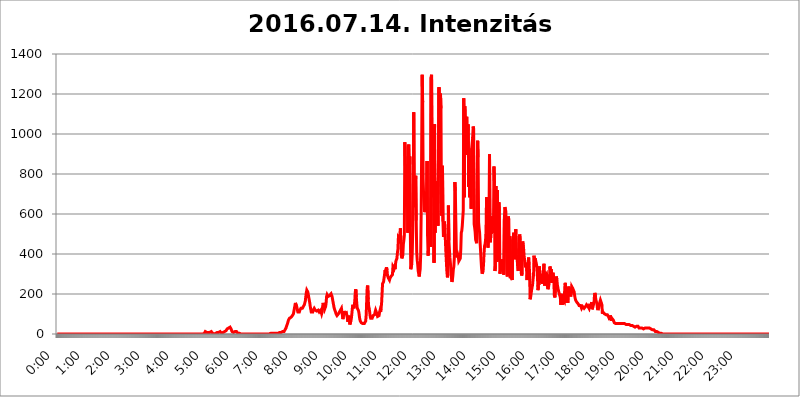
| Category | 2016.07.14. Intenzitás [W/m^2] |
|---|---|
| 0.0 | 0 |
| 0.0006944444444444445 | 0 |
| 0.001388888888888889 | 0 |
| 0.0020833333333333333 | 0 |
| 0.002777777777777778 | 0 |
| 0.003472222222222222 | 0 |
| 0.004166666666666667 | 0 |
| 0.004861111111111111 | 0 |
| 0.005555555555555556 | 0 |
| 0.0062499999999999995 | 0 |
| 0.006944444444444444 | 0 |
| 0.007638888888888889 | 0 |
| 0.008333333333333333 | 0 |
| 0.009027777777777779 | 0 |
| 0.009722222222222222 | 0 |
| 0.010416666666666666 | 0 |
| 0.011111111111111112 | 0 |
| 0.011805555555555555 | 0 |
| 0.012499999999999999 | 0 |
| 0.013194444444444444 | 0 |
| 0.013888888888888888 | 0 |
| 0.014583333333333332 | 0 |
| 0.015277777777777777 | 0 |
| 0.015972222222222224 | 0 |
| 0.016666666666666666 | 0 |
| 0.017361111111111112 | 0 |
| 0.018055555555555557 | 0 |
| 0.01875 | 0 |
| 0.019444444444444445 | 0 |
| 0.02013888888888889 | 0 |
| 0.020833333333333332 | 0 |
| 0.02152777777777778 | 0 |
| 0.022222222222222223 | 0 |
| 0.02291666666666667 | 0 |
| 0.02361111111111111 | 0 |
| 0.024305555555555556 | 0 |
| 0.024999999999999998 | 0 |
| 0.025694444444444447 | 0 |
| 0.02638888888888889 | 0 |
| 0.027083333333333334 | 0 |
| 0.027777777777777776 | 0 |
| 0.02847222222222222 | 0 |
| 0.029166666666666664 | 0 |
| 0.029861111111111113 | 0 |
| 0.030555555555555555 | 0 |
| 0.03125 | 0 |
| 0.03194444444444445 | 0 |
| 0.03263888888888889 | 0 |
| 0.03333333333333333 | 0 |
| 0.034027777777777775 | 0 |
| 0.034722222222222224 | 0 |
| 0.035416666666666666 | 0 |
| 0.036111111111111115 | 0 |
| 0.03680555555555556 | 0 |
| 0.0375 | 0 |
| 0.03819444444444444 | 0 |
| 0.03888888888888889 | 0 |
| 0.03958333333333333 | 0 |
| 0.04027777777777778 | 0 |
| 0.04097222222222222 | 0 |
| 0.041666666666666664 | 0 |
| 0.042361111111111106 | 0 |
| 0.04305555555555556 | 0 |
| 0.043750000000000004 | 0 |
| 0.044444444444444446 | 0 |
| 0.04513888888888889 | 0 |
| 0.04583333333333334 | 0 |
| 0.04652777777777778 | 0 |
| 0.04722222222222222 | 0 |
| 0.04791666666666666 | 0 |
| 0.04861111111111111 | 0 |
| 0.049305555555555554 | 0 |
| 0.049999999999999996 | 0 |
| 0.05069444444444445 | 0 |
| 0.051388888888888894 | 0 |
| 0.052083333333333336 | 0 |
| 0.05277777777777778 | 0 |
| 0.05347222222222222 | 0 |
| 0.05416666666666667 | 0 |
| 0.05486111111111111 | 0 |
| 0.05555555555555555 | 0 |
| 0.05625 | 0 |
| 0.05694444444444444 | 0 |
| 0.057638888888888885 | 0 |
| 0.05833333333333333 | 0 |
| 0.05902777777777778 | 0 |
| 0.059722222222222225 | 0 |
| 0.06041666666666667 | 0 |
| 0.061111111111111116 | 0 |
| 0.06180555555555556 | 0 |
| 0.0625 | 0 |
| 0.06319444444444444 | 0 |
| 0.06388888888888888 | 0 |
| 0.06458333333333334 | 0 |
| 0.06527777777777778 | 0 |
| 0.06597222222222222 | 0 |
| 0.06666666666666667 | 0 |
| 0.06736111111111111 | 0 |
| 0.06805555555555555 | 0 |
| 0.06874999999999999 | 0 |
| 0.06944444444444443 | 0 |
| 0.07013888888888889 | 0 |
| 0.07083333333333333 | 0 |
| 0.07152777777777779 | 0 |
| 0.07222222222222223 | 0 |
| 0.07291666666666667 | 0 |
| 0.07361111111111111 | 0 |
| 0.07430555555555556 | 0 |
| 0.075 | 0 |
| 0.07569444444444444 | 0 |
| 0.0763888888888889 | 0 |
| 0.07708333333333334 | 0 |
| 0.07777777777777778 | 0 |
| 0.07847222222222222 | 0 |
| 0.07916666666666666 | 0 |
| 0.0798611111111111 | 0 |
| 0.08055555555555556 | 0 |
| 0.08125 | 0 |
| 0.08194444444444444 | 0 |
| 0.08263888888888889 | 0 |
| 0.08333333333333333 | 0 |
| 0.08402777777777777 | 0 |
| 0.08472222222222221 | 0 |
| 0.08541666666666665 | 0 |
| 0.08611111111111112 | 0 |
| 0.08680555555555557 | 0 |
| 0.08750000000000001 | 0 |
| 0.08819444444444445 | 0 |
| 0.08888888888888889 | 0 |
| 0.08958333333333333 | 0 |
| 0.09027777777777778 | 0 |
| 0.09097222222222222 | 0 |
| 0.09166666666666667 | 0 |
| 0.09236111111111112 | 0 |
| 0.09305555555555556 | 0 |
| 0.09375 | 0 |
| 0.09444444444444444 | 0 |
| 0.09513888888888888 | 0 |
| 0.09583333333333333 | 0 |
| 0.09652777777777777 | 0 |
| 0.09722222222222222 | 0 |
| 0.09791666666666667 | 0 |
| 0.09861111111111111 | 0 |
| 0.09930555555555555 | 0 |
| 0.09999999999999999 | 0 |
| 0.10069444444444443 | 0 |
| 0.1013888888888889 | 0 |
| 0.10208333333333335 | 0 |
| 0.10277777777777779 | 0 |
| 0.10347222222222223 | 0 |
| 0.10416666666666667 | 0 |
| 0.10486111111111111 | 0 |
| 0.10555555555555556 | 0 |
| 0.10625 | 0 |
| 0.10694444444444444 | 0 |
| 0.1076388888888889 | 0 |
| 0.10833333333333334 | 0 |
| 0.10902777777777778 | 0 |
| 0.10972222222222222 | 0 |
| 0.1111111111111111 | 0 |
| 0.11180555555555556 | 0 |
| 0.11180555555555556 | 0 |
| 0.1125 | 0 |
| 0.11319444444444444 | 0 |
| 0.11388888888888889 | 0 |
| 0.11458333333333333 | 0 |
| 0.11527777777777777 | 0 |
| 0.11597222222222221 | 0 |
| 0.11666666666666665 | 0 |
| 0.1173611111111111 | 0 |
| 0.11805555555555557 | 0 |
| 0.11944444444444445 | 0 |
| 0.12013888888888889 | 0 |
| 0.12083333333333333 | 0 |
| 0.12152777777777778 | 0 |
| 0.12222222222222223 | 0 |
| 0.12291666666666667 | 0 |
| 0.12291666666666667 | 0 |
| 0.12361111111111112 | 0 |
| 0.12430555555555556 | 0 |
| 0.125 | 0 |
| 0.12569444444444444 | 0 |
| 0.12638888888888888 | 0 |
| 0.12708333333333333 | 0 |
| 0.16875 | 0 |
| 0.12847222222222224 | 0 |
| 0.12916666666666668 | 0 |
| 0.12986111111111112 | 0 |
| 0.13055555555555556 | 0 |
| 0.13125 | 0 |
| 0.13194444444444445 | 0 |
| 0.1326388888888889 | 0 |
| 0.13333333333333333 | 0 |
| 0.13402777777777777 | 0 |
| 0.13402777777777777 | 0 |
| 0.13472222222222222 | 0 |
| 0.13541666666666666 | 0 |
| 0.1361111111111111 | 0 |
| 0.13749999999999998 | 0 |
| 0.13819444444444443 | 0 |
| 0.1388888888888889 | 0 |
| 0.13958333333333334 | 0 |
| 0.14027777777777778 | 0 |
| 0.14097222222222222 | 0 |
| 0.14166666666666666 | 0 |
| 0.1423611111111111 | 0 |
| 0.14305555555555557 | 0 |
| 0.14375000000000002 | 0 |
| 0.14444444444444446 | 0 |
| 0.1451388888888889 | 0 |
| 0.1451388888888889 | 0 |
| 0.14652777777777778 | 0 |
| 0.14722222222222223 | 0 |
| 0.14791666666666667 | 0 |
| 0.1486111111111111 | 0 |
| 0.14930555555555555 | 0 |
| 0.15 | 0 |
| 0.15069444444444444 | 0 |
| 0.15138888888888888 | 0 |
| 0.15208333333333332 | 0 |
| 0.15277777777777776 | 0 |
| 0.15347222222222223 | 0 |
| 0.15416666666666667 | 0 |
| 0.15486111111111112 | 0 |
| 0.15555555555555556 | 0 |
| 0.15625 | 0 |
| 0.15694444444444444 | 0 |
| 0.15763888888888888 | 0 |
| 0.15833333333333333 | 0 |
| 0.15902777777777777 | 0 |
| 0.15972222222222224 | 0 |
| 0.16041666666666668 | 0 |
| 0.16111111111111112 | 0 |
| 0.16180555555555556 | 0 |
| 0.1625 | 0 |
| 0.16319444444444445 | 0 |
| 0.1638888888888889 | 0 |
| 0.16458333333333333 | 0 |
| 0.16527777777777777 | 0 |
| 0.16597222222222222 | 0 |
| 0.16666666666666666 | 0 |
| 0.1673611111111111 | 0 |
| 0.16805555555555554 | 0 |
| 0.16874999999999998 | 0 |
| 0.16944444444444443 | 0 |
| 0.17013888888888887 | 0 |
| 0.1708333333333333 | 0 |
| 0.17152777777777775 | 0 |
| 0.17222222222222225 | 0 |
| 0.1729166666666667 | 0 |
| 0.17361111111111113 | 0 |
| 0.17430555555555557 | 0 |
| 0.17500000000000002 | 0 |
| 0.17569444444444446 | 0 |
| 0.1763888888888889 | 0 |
| 0.17708333333333334 | 0 |
| 0.17777777777777778 | 0 |
| 0.17847222222222223 | 0 |
| 0.17916666666666667 | 0 |
| 0.1798611111111111 | 0 |
| 0.18055555555555555 | 0 |
| 0.18125 | 0 |
| 0.18194444444444444 | 0 |
| 0.1826388888888889 | 0 |
| 0.18333333333333335 | 0 |
| 0.1840277777777778 | 0 |
| 0.18472222222222223 | 0 |
| 0.18541666666666667 | 0 |
| 0.18611111111111112 | 0 |
| 0.18680555555555556 | 0 |
| 0.1875 | 0 |
| 0.18819444444444444 | 0 |
| 0.18888888888888888 | 0 |
| 0.18958333333333333 | 0 |
| 0.19027777777777777 | 0 |
| 0.1909722222222222 | 0 |
| 0.19166666666666665 | 0 |
| 0.19236111111111112 | 0 |
| 0.19305555555555554 | 0 |
| 0.19375 | 0 |
| 0.19444444444444445 | 0 |
| 0.1951388888888889 | 0 |
| 0.19583333333333333 | 0 |
| 0.19652777777777777 | 0 |
| 0.19722222222222222 | 0 |
| 0.19791666666666666 | 0 |
| 0.1986111111111111 | 0 |
| 0.19930555555555554 | 0 |
| 0.19999999999999998 | 0 |
| 0.20069444444444443 | 0 |
| 0.20138888888888887 | 0 |
| 0.2020833333333333 | 0 |
| 0.2027777777777778 | 0 |
| 0.2034722222222222 | 0 |
| 0.2041666666666667 | 0 |
| 0.20486111111111113 | 0 |
| 0.20555555555555557 | 3.525 |
| 0.20625000000000002 | 3.525 |
| 0.20694444444444446 | 7.887 |
| 0.2076388888888889 | 12.257 |
| 0.20833333333333334 | 7.887 |
| 0.20902777777777778 | 7.887 |
| 0.20972222222222223 | 7.887 |
| 0.21041666666666667 | 7.887 |
| 0.2111111111111111 | 7.887 |
| 0.21180555555555555 | 7.887 |
| 0.2125 | 7.887 |
| 0.21319444444444444 | 7.887 |
| 0.2138888888888889 | 7.887 |
| 0.21458333333333335 | 12.257 |
| 0.2152777777777778 | 12.257 |
| 0.21597222222222223 | 12.257 |
| 0.21666666666666667 | 7.887 |
| 0.21736111111111112 | 7.887 |
| 0.21805555555555556 | 3.525 |
| 0.21875 | 0 |
| 0.21944444444444444 | 0 |
| 0.22013888888888888 | 0 |
| 0.22083333333333333 | 0 |
| 0.22152777777777777 | 0 |
| 0.2222222222222222 | 3.525 |
| 0.22291666666666665 | 3.525 |
| 0.2236111111111111 | 7.887 |
| 0.22430555555555556 | 7.887 |
| 0.225 | 7.887 |
| 0.22569444444444445 | 7.887 |
| 0.2263888888888889 | 7.887 |
| 0.22708333333333333 | 12.257 |
| 0.22777777777777777 | 12.257 |
| 0.22847222222222222 | 12.257 |
| 0.22916666666666666 | 12.257 |
| 0.2298611111111111 | 7.887 |
| 0.23055555555555554 | 3.525 |
| 0.23124999999999998 | 3.525 |
| 0.23194444444444443 | 3.525 |
| 0.23263888888888887 | 7.887 |
| 0.2333333333333333 | 7.887 |
| 0.2340277777777778 | 12.257 |
| 0.2347222222222222 | 12.257 |
| 0.2354166666666667 | 12.257 |
| 0.23611111111111113 | 12.257 |
| 0.23680555555555557 | 16.636 |
| 0.23750000000000002 | 21.024 |
| 0.23819444444444446 | 25.419 |
| 0.2388888888888889 | 29.823 |
| 0.23958333333333334 | 29.823 |
| 0.24027777777777778 | 29.823 |
| 0.24097222222222223 | 29.823 |
| 0.24166666666666667 | 34.234 |
| 0.2423611111111111 | 34.234 |
| 0.24305555555555555 | 29.823 |
| 0.24375 | 25.419 |
| 0.24444444444444446 | 21.024 |
| 0.24513888888888888 | 12.257 |
| 0.24583333333333335 | 12.257 |
| 0.2465277777777778 | 7.887 |
| 0.24722222222222223 | 7.887 |
| 0.24791666666666667 | 7.887 |
| 0.24861111111111112 | 12.257 |
| 0.24930555555555556 | 12.257 |
| 0.25 | 12.257 |
| 0.25069444444444444 | 16.636 |
| 0.2513888888888889 | 12.257 |
| 0.2520833333333333 | 12.257 |
| 0.25277777777777777 | 7.887 |
| 0.2534722222222222 | 3.525 |
| 0.25416666666666665 | 3.525 |
| 0.2548611111111111 | 3.525 |
| 0.2555555555555556 | 3.525 |
| 0.25625000000000003 | 0 |
| 0.2569444444444445 | 0 |
| 0.2576388888888889 | 0 |
| 0.25833333333333336 | 0 |
| 0.2590277777777778 | 0 |
| 0.25972222222222224 | 0 |
| 0.2604166666666667 | 0 |
| 0.2611111111111111 | 0 |
| 0.26180555555555557 | 0 |
| 0.2625 | 0 |
| 0.26319444444444445 | 0 |
| 0.2638888888888889 | 0 |
| 0.26458333333333334 | 0 |
| 0.2652777777777778 | 0 |
| 0.2659722222222222 | 0 |
| 0.26666666666666666 | 0 |
| 0.2673611111111111 | 0 |
| 0.26805555555555555 | 0 |
| 0.26875 | 0 |
| 0.26944444444444443 | 0 |
| 0.2701388888888889 | 0 |
| 0.2708333333333333 | 0 |
| 0.27152777777777776 | 0 |
| 0.2722222222222222 | 0 |
| 0.27291666666666664 | 0 |
| 0.2736111111111111 | 0 |
| 0.2743055555555555 | 0 |
| 0.27499999999999997 | 0 |
| 0.27569444444444446 | 0 |
| 0.27638888888888885 | 0 |
| 0.27708333333333335 | 0 |
| 0.2777777777777778 | 0 |
| 0.27847222222222223 | 0 |
| 0.2791666666666667 | 0 |
| 0.2798611111111111 | 0 |
| 0.28055555555555556 | 0 |
| 0.28125 | 0 |
| 0.28194444444444444 | 0 |
| 0.2826388888888889 | 0 |
| 0.2833333333333333 | 0 |
| 0.28402777777777777 | 0 |
| 0.2847222222222222 | 0 |
| 0.28541666666666665 | 0 |
| 0.28611111111111115 | 0 |
| 0.28680555555555554 | 0 |
| 0.28750000000000003 | 0 |
| 0.2881944444444445 | 0 |
| 0.2888888888888889 | 0 |
| 0.28958333333333336 | 0 |
| 0.2902777777777778 | 0 |
| 0.29097222222222224 | 0 |
| 0.2916666666666667 | 0 |
| 0.2923611111111111 | 0 |
| 0.29305555555555557 | 0 |
| 0.29375 | 0 |
| 0.29444444444444445 | 0 |
| 0.2951388888888889 | 0 |
| 0.29583333333333334 | 0 |
| 0.2965277777777778 | 0 |
| 0.2972222222222222 | 0 |
| 0.29791666666666666 | 0 |
| 0.2986111111111111 | 0 |
| 0.29930555555555555 | 3.525 |
| 0.3 | 0 |
| 0.30069444444444443 | 0 |
| 0.3013888888888889 | 3.525 |
| 0.3020833333333333 | 3.525 |
| 0.30277777777777776 | 3.525 |
| 0.3034722222222222 | 3.525 |
| 0.30416666666666664 | 3.525 |
| 0.3048611111111111 | 3.525 |
| 0.3055555555555555 | 3.525 |
| 0.30624999999999997 | 3.525 |
| 0.3069444444444444 | 3.525 |
| 0.3076388888888889 | 3.525 |
| 0.30833333333333335 | 3.525 |
| 0.3090277777777778 | 3.525 |
| 0.30972222222222223 | 3.525 |
| 0.3104166666666667 | 3.525 |
| 0.3111111111111111 | 3.525 |
| 0.31180555555555556 | 7.887 |
| 0.3125 | 7.887 |
| 0.31319444444444444 | 7.887 |
| 0.3138888888888889 | 7.887 |
| 0.3145833333333333 | 7.887 |
| 0.31527777777777777 | 7.887 |
| 0.3159722222222222 | 12.257 |
| 0.31666666666666665 | 12.257 |
| 0.31736111111111115 | 12.257 |
| 0.31805555555555554 | 12.257 |
| 0.31875000000000003 | 16.636 |
| 0.3194444444444445 | 21.024 |
| 0.3201388888888889 | 25.419 |
| 0.32083333333333336 | 29.823 |
| 0.3215277777777778 | 38.653 |
| 0.32222222222222224 | 43.079 |
| 0.3229166666666667 | 51.951 |
| 0.3236111111111111 | 60.85 |
| 0.32430555555555557 | 69.775 |
| 0.325 | 74.246 |
| 0.32569444444444445 | 78.722 |
| 0.3263888888888889 | 78.722 |
| 0.32708333333333334 | 83.205 |
| 0.3277777777777778 | 83.205 |
| 0.3284722222222222 | 83.205 |
| 0.32916666666666666 | 87.692 |
| 0.3298611111111111 | 92.184 |
| 0.33055555555555555 | 96.682 |
| 0.33125 | 101.184 |
| 0.33194444444444443 | 114.716 |
| 0.3326388888888889 | 128.284 |
| 0.3333333333333333 | 141.884 |
| 0.3340277777777778 | 155.509 |
| 0.3347222222222222 | 160.056 |
| 0.3354166666666667 | 150.964 |
| 0.3361111111111111 | 132.814 |
| 0.3368055555555556 | 119.235 |
| 0.33749999999999997 | 110.201 |
| 0.33819444444444446 | 110.201 |
| 0.33888888888888885 | 110.201 |
| 0.33958333333333335 | 110.201 |
| 0.34027777777777773 | 119.235 |
| 0.34097222222222223 | 123.758 |
| 0.3416666666666666 | 128.284 |
| 0.3423611111111111 | 128.284 |
| 0.3430555555555555 | 128.284 |
| 0.34375 | 128.284 |
| 0.3444444444444445 | 132.814 |
| 0.3451388888888889 | 137.347 |
| 0.3458333333333334 | 141.884 |
| 0.34652777777777777 | 146.423 |
| 0.34722222222222227 | 150.964 |
| 0.34791666666666665 | 164.605 |
| 0.34861111111111115 | 187.378 |
| 0.34930555555555554 | 205.62 |
| 0.35000000000000003 | 219.309 |
| 0.3506944444444444 | 219.309 |
| 0.3513888888888889 | 210.182 |
| 0.3520833333333333 | 196.497 |
| 0.3527777777777778 | 182.82 |
| 0.3534722222222222 | 169.156 |
| 0.3541666666666667 | 155.509 |
| 0.3548611111111111 | 137.347 |
| 0.35555555555555557 | 123.758 |
| 0.35625 | 110.201 |
| 0.35694444444444445 | 105.69 |
| 0.3576388888888889 | 110.201 |
| 0.35833333333333334 | 110.201 |
| 0.3590277777777778 | 119.235 |
| 0.3597222222222222 | 123.758 |
| 0.36041666666666666 | 128.284 |
| 0.3611111111111111 | 123.758 |
| 0.36180555555555555 | 119.235 |
| 0.3625 | 114.716 |
| 0.36319444444444443 | 114.716 |
| 0.3638888888888889 | 114.716 |
| 0.3645833333333333 | 119.235 |
| 0.3652777777777778 | 119.235 |
| 0.3659722222222222 | 119.235 |
| 0.3666666666666667 | 119.235 |
| 0.3673611111111111 | 110.201 |
| 0.3680555555555556 | 110.201 |
| 0.36874999999999997 | 114.716 |
| 0.36944444444444446 | 119.235 |
| 0.37013888888888885 | 114.716 |
| 0.37083333333333335 | 101.184 |
| 0.37152777777777773 | 110.201 |
| 0.37222222222222223 | 137.347 |
| 0.3729166666666666 | 155.509 |
| 0.3736111111111111 | 155.509 |
| 0.3743055555555555 | 150.964 |
| 0.375 | 123.758 |
| 0.3756944444444445 | 128.284 |
| 0.3763888888888889 | 137.347 |
| 0.3770833333333334 | 155.509 |
| 0.37777777777777777 | 187.378 |
| 0.37847222222222227 | 196.497 |
| 0.37916666666666665 | 191.937 |
| 0.37986111111111115 | 187.378 |
| 0.38055555555555554 | 182.82 |
| 0.38125000000000003 | 187.378 |
| 0.3819444444444444 | 191.937 |
| 0.3826388888888889 | 196.497 |
| 0.3833333333333333 | 196.497 |
| 0.3840277777777778 | 201.058 |
| 0.3847222222222222 | 196.497 |
| 0.3854166666666667 | 187.378 |
| 0.3861111111111111 | 173.709 |
| 0.38680555555555557 | 160.056 |
| 0.3875 | 146.423 |
| 0.38819444444444445 | 132.814 |
| 0.3888888888888889 | 123.758 |
| 0.38958333333333334 | 119.235 |
| 0.3902777777777778 | 110.201 |
| 0.3909722222222222 | 101.184 |
| 0.39166666666666666 | 96.682 |
| 0.3923611111111111 | 92.184 |
| 0.39305555555555555 | 87.692 |
| 0.39375 | 92.184 |
| 0.39444444444444443 | 101.184 |
| 0.3951388888888889 | 105.69 |
| 0.3958333333333333 | 110.201 |
| 0.3965277777777778 | 114.716 |
| 0.3972222222222222 | 119.235 |
| 0.3979166666666667 | 123.758 |
| 0.3986111111111111 | 128.284 |
| 0.3993055555555556 | 123.758 |
| 0.39999999999999997 | 92.184 |
| 0.40069444444444446 | 74.246 |
| 0.40138888888888885 | 96.682 |
| 0.40208333333333335 | 114.716 |
| 0.40277777777777773 | 114.716 |
| 0.40347222222222223 | 101.184 |
| 0.4041666666666666 | 96.682 |
| 0.4048611111111111 | 105.69 |
| 0.4055555555555555 | 105.69 |
| 0.40625 | 101.184 |
| 0.4069444444444445 | 78.722 |
| 0.4076388888888889 | 60.85 |
| 0.4083333333333334 | 78.722 |
| 0.40902777777777777 | 92.184 |
| 0.40972222222222227 | 65.31 |
| 0.41041666666666665 | 47.511 |
| 0.41111111111111115 | 51.951 |
| 0.41180555555555554 | 65.31 |
| 0.41250000000000003 | 78.722 |
| 0.4131944444444444 | 101.184 |
| 0.4138888888888889 | 128.284 |
| 0.4145833333333333 | 146.423 |
| 0.4152777777777778 | 141.884 |
| 0.4159722222222222 | 128.284 |
| 0.4166666666666667 | 141.884 |
| 0.4173611111111111 | 169.156 |
| 0.41805555555555557 | 210.182 |
| 0.41875 | 223.873 |
| 0.41944444444444445 | 182.82 |
| 0.4201388888888889 | 150.964 |
| 0.42083333333333334 | 128.284 |
| 0.4215277777777778 | 123.758 |
| 0.4222222222222222 | 119.235 |
| 0.42291666666666666 | 110.201 |
| 0.4236111111111111 | 92.184 |
| 0.42430555555555555 | 74.246 |
| 0.425 | 65.31 |
| 0.42569444444444443 | 60.85 |
| 0.4263888888888889 | 56.398 |
| 0.4270833333333333 | 56.398 |
| 0.4277777777777778 | 56.398 |
| 0.4284722222222222 | 51.951 |
| 0.4291666666666667 | 47.511 |
| 0.4298611111111111 | 47.511 |
| 0.4305555555555556 | 51.951 |
| 0.43124999999999997 | 56.398 |
| 0.43194444444444446 | 56.398 |
| 0.43263888888888885 | 65.31 |
| 0.43333333333333335 | 96.682 |
| 0.43402777777777773 | 169.156 |
| 0.43472222222222223 | 233 |
| 0.4354166666666666 | 242.127 |
| 0.4361111111111111 | 173.709 |
| 0.4368055555555555 | 137.347 |
| 0.4375 | 128.284 |
| 0.4381944444444445 | 110.201 |
| 0.4388888888888889 | 87.692 |
| 0.4395833333333334 | 78.722 |
| 0.44027777777777777 | 74.246 |
| 0.44097222222222227 | 74.246 |
| 0.44166666666666665 | 78.722 |
| 0.44236111111111115 | 83.205 |
| 0.44305555555555554 | 92.184 |
| 0.44375000000000003 | 92.184 |
| 0.4444444444444444 | 96.682 |
| 0.4451388888888889 | 96.682 |
| 0.4458333333333333 | 110.201 |
| 0.4465277777777778 | 119.235 |
| 0.4472222222222222 | 114.716 |
| 0.4479166666666667 | 105.69 |
| 0.4486111111111111 | 101.184 |
| 0.44930555555555557 | 87.692 |
| 0.45 | 87.692 |
| 0.45069444444444445 | 92.184 |
| 0.4513888888888889 | 92.184 |
| 0.45208333333333334 | 110.201 |
| 0.4527777777777778 | 119.235 |
| 0.4534722222222222 | 110.201 |
| 0.45416666666666666 | 128.284 |
| 0.4548611111111111 | 150.964 |
| 0.45555555555555555 | 201.058 |
| 0.45625 | 251.251 |
| 0.45694444444444443 | 246.689 |
| 0.4576388888888889 | 260.373 |
| 0.4583333333333333 | 278.603 |
| 0.4590277777777778 | 296.808 |
| 0.4597222222222222 | 319.517 |
| 0.4604166666666667 | 310.44 |
| 0.4611111111111111 | 314.98 |
| 0.4618055555555556 | 333.113 |
| 0.46249999999999997 | 319.517 |
| 0.46319444444444446 | 292.259 |
| 0.46388888888888885 | 287.709 |
| 0.46458333333333335 | 278.603 |
| 0.46527777777777773 | 274.047 |
| 0.46597222222222223 | 269.49 |
| 0.4666666666666666 | 278.603 |
| 0.4673611111111111 | 274.047 |
| 0.4680555555555555 | 287.709 |
| 0.46875 | 292.259 |
| 0.4694444444444445 | 283.156 |
| 0.4701388888888889 | 296.808 |
| 0.4708333333333334 | 337.639 |
| 0.47152777777777777 | 333.113 |
| 0.47222222222222227 | 328.584 |
| 0.47291666666666665 | 346.682 |
| 0.47361111111111115 | 324.052 |
| 0.47430555555555554 | 346.682 |
| 0.47500000000000003 | 364.728 |
| 0.4756944444444444 | 369.23 |
| 0.4763888888888889 | 378.224 |
| 0.4770833333333333 | 405.108 |
| 0.4777777777777778 | 422.943 |
| 0.4784722222222222 | 480.356 |
| 0.4791666666666667 | 484.735 |
| 0.4798611111111111 | 471.582 |
| 0.48055555555555557 | 467.187 |
| 0.48125 | 528.2 |
| 0.48194444444444445 | 458.38 |
| 0.4826388888888889 | 391.685 |
| 0.48333333333333334 | 378.224 |
| 0.4840277777777778 | 382.715 |
| 0.4847222222222222 | 396.164 |
| 0.48541666666666666 | 449.551 |
| 0.4861111111111111 | 467.187 |
| 0.48680555555555555 | 493.475 |
| 0.4875 | 958.814 |
| 0.48819444444444443 | 841.526 |
| 0.4888888888888889 | 638.256 |
| 0.4895833333333333 | 767.62 |
| 0.4902777777777778 | 849.199 |
| 0.4909722222222222 | 731.896 |
| 0.4916666666666667 | 506.542 |
| 0.4923611111111111 | 936.33 |
| 0.4930555555555556 | 947.58 |
| 0.49374999999999997 | 763.674 |
| 0.49444444444444446 | 887.309 |
| 0.49513888888888885 | 536.82 |
| 0.49583333333333335 | 324.052 |
| 0.49652777777777773 | 319.517 |
| 0.49722222222222223 | 351.198 |
| 0.4979166666666666 | 405.108 |
| 0.4986111111111111 | 519.555 |
| 0.4993055555555555 | 687.544 |
| 0.5 | 1108.816 |
| 0.5006944444444444 | 679.395 |
| 0.5013888888888889 | 634.105 |
| 0.5020833333333333 | 703.762 |
| 0.5027777777777778 | 791.169 |
| 0.5034722222222222 | 566.793 |
| 0.5041666666666667 | 409.574 |
| 0.5048611111111111 | 369.23 |
| 0.5055555555555555 | 346.682 |
| 0.50625 | 314.98 |
| 0.5069444444444444 | 301.354 |
| 0.5076388888888889 | 287.709 |
| 0.5083333333333333 | 305.898 |
| 0.5090277777777777 | 324.052 |
| 0.5097222222222222 | 396.164 |
| 0.5104166666666666 | 604.864 |
| 0.5111111111111112 | 928.819 |
| 0.5118055555555555 | 1296.248 |
| 0.5125000000000001 | 1158.689 |
| 0.5131944444444444 | 775.492 |
| 0.513888888888889 | 687.544 |
| 0.5145833333333333 | 691.608 |
| 0.5152777777777778 | 609.062 |
| 0.5159722222222222 | 625.784 |
| 0.5166666666666667 | 679.395 |
| 0.517361111111111 | 711.832 |
| 0.5180555555555556 | 663.019 |
| 0.5187499999999999 | 864.493 |
| 0.5194444444444445 | 489.108 |
| 0.5201388888888888 | 391.685 |
| 0.5208333333333334 | 436.27 |
| 0.5215277777777778 | 436.27 |
| 0.5222222222222223 | 471.582 |
| 0.5229166666666667 | 532.513 |
| 0.5236111111111111 | 436.27 |
| 0.5243055555555556 | 1283.541 |
| 0.525 | 1296.248 |
| 0.5256944444444445 | 802.868 |
| 0.5263888888888889 | 879.719 |
| 0.5270833333333333 | 683.473 |
| 0.5277777777777778 | 894.885 |
| 0.5284722222222222 | 355.712 |
| 0.5291666666666667 | 1048.508 |
| 0.5298611111111111 | 506.542 |
| 0.5305555555555556 | 763.674 |
| 0.53125 | 658.909 |
| 0.5319444444444444 | 545.416 |
| 0.5326388888888889 | 695.666 |
| 0.5333333333333333 | 638.256 |
| 0.5340277777777778 | 541.121 |
| 0.5347222222222222 | 545.416 |
| 0.5354166666666667 | 1233.951 |
| 0.5361111111111111 | 818.392 |
| 0.5368055555555555 | 1186.03 |
| 0.5375 | 1201.843 |
| 0.5381944444444444 | 1127.879 |
| 0.5388888888888889 | 592.233 |
| 0.5395833333333333 | 810.641 |
| 0.5402777777777777 | 841.526 |
| 0.5409722222222222 | 562.53 |
| 0.5416666666666666 | 484.735 |
| 0.5423611111111112 | 497.836 |
| 0.5430555555555555 | 562.53 |
| 0.5437500000000001 | 523.88 |
| 0.5444444444444444 | 462.786 |
| 0.545138888888889 | 405.108 |
| 0.5458333333333333 | 355.712 |
| 0.5465277777777778 | 310.44 |
| 0.5472222222222222 | 283.156 |
| 0.5479166666666667 | 301.354 |
| 0.548611111111111 | 642.4 |
| 0.5493055555555556 | 467.187 |
| 0.5499999999999999 | 422.943 |
| 0.5506944444444445 | 382.715 |
| 0.5513888888888888 | 355.712 |
| 0.5520833333333334 | 324.052 |
| 0.5527777777777778 | 283.156 |
| 0.5534722222222223 | 260.373 |
| 0.5541666666666667 | 269.49 |
| 0.5548611111111111 | 292.259 |
| 0.5555555555555556 | 324.052 |
| 0.55625 | 337.639 |
| 0.5569444444444445 | 382.715 |
| 0.5576388888888889 | 759.723 |
| 0.5583333333333333 | 715.858 |
| 0.5590277777777778 | 562.53 |
| 0.5597222222222222 | 427.39 |
| 0.5604166666666667 | 382.715 |
| 0.5611111111111111 | 387.202 |
| 0.5618055555555556 | 396.164 |
| 0.5625 | 387.202 |
| 0.5631944444444444 | 364.728 |
| 0.5638888888888889 | 360.221 |
| 0.5645833333333333 | 360.221 |
| 0.5652777777777778 | 378.224 |
| 0.5659722222222222 | 422.943 |
| 0.5666666666666667 | 506.542 |
| 0.5673611111111111 | 515.223 |
| 0.5680555555555555 | 541.121 |
| 0.56875 | 536.82 |
| 0.5694444444444444 | 617.436 |
| 0.5701388888888889 | 1178.177 |
| 0.5708333333333333 | 683.473 |
| 0.5715277777777777 | 1139.384 |
| 0.5722222222222222 | 1074.789 |
| 0.5729166666666666 | 894.885 |
| 0.5736111111111112 | 977.508 |
| 0.5743055555555555 | 1086.097 |
| 0.5750000000000001 | 909.996 |
| 0.5756944444444444 | 1041.019 |
| 0.576388888888889 | 1048.508 |
| 0.5770833333333333 | 735.89 |
| 0.5777777777777778 | 853.029 |
| 0.5784722222222222 | 683.473 |
| 0.5791666666666667 | 891.099 |
| 0.579861111111111 | 771.559 |
| 0.5805555555555556 | 625.784 |
| 0.5812499999999999 | 928.819 |
| 0.5819444444444445 | 932.576 |
| 0.5826388888888888 | 981.244 |
| 0.5833333333333334 | 1037.277 |
| 0.5840277777777778 | 1026.06 |
| 0.5847222222222223 | 549.704 |
| 0.5854166666666667 | 532.513 |
| 0.5861111111111111 | 510.885 |
| 0.5868055555555556 | 471.582 |
| 0.5875 | 462.786 |
| 0.5881944444444445 | 453.968 |
| 0.5888888888888889 | 453.968 |
| 0.5895833333333333 | 966.295 |
| 0.5902777777777778 | 883.516 |
| 0.5909722222222222 | 558.261 |
| 0.5916666666666667 | 528.2 |
| 0.5923611111111111 | 506.542 |
| 0.5930555555555556 | 458.38 |
| 0.59375 | 414.035 |
| 0.5944444444444444 | 369.23 |
| 0.5951388888888889 | 328.584 |
| 0.5958333333333333 | 301.354 |
| 0.5965277777777778 | 296.808 |
| 0.5972222222222222 | 314.98 |
| 0.5979166666666667 | 351.198 |
| 0.5986111111111111 | 405.108 |
| 0.5993055555555555 | 440.702 |
| 0.6 | 449.551 |
| 0.6006944444444444 | 467.187 |
| 0.6013888888888889 | 515.223 |
| 0.6020833333333333 | 683.473 |
| 0.6027777777777777 | 532.513 |
| 0.6034722222222222 | 471.582 |
| 0.6041666666666666 | 431.833 |
| 0.6048611111111112 | 431.833 |
| 0.6055555555555555 | 575.299 |
| 0.6062500000000001 | 898.668 |
| 0.6069444444444444 | 515.223 |
| 0.607638888888889 | 458.38 |
| 0.6083333333333333 | 536.82 |
| 0.6090277777777778 | 502.192 |
| 0.6097222222222222 | 588.009 |
| 0.6104166666666667 | 506.542 |
| 0.611111111111111 | 510.885 |
| 0.6118055555555556 | 536.82 |
| 0.6124999999999999 | 837.682 |
| 0.6131944444444445 | 751.803 |
| 0.6138888888888888 | 314.98 |
| 0.6145833333333334 | 342.162 |
| 0.6152777777777778 | 739.877 |
| 0.6159722222222223 | 418.492 |
| 0.6166666666666667 | 360.221 |
| 0.6173611111111111 | 719.877 |
| 0.6180555555555556 | 369.23 |
| 0.61875 | 506.542 |
| 0.6194444444444445 | 658.909 |
| 0.6201388888888889 | 613.252 |
| 0.6208333333333333 | 301.354 |
| 0.6215277777777778 | 296.808 |
| 0.6222222222222222 | 305.898 |
| 0.6229166666666667 | 351.198 |
| 0.6236111111111111 | 373.729 |
| 0.6243055555555556 | 364.728 |
| 0.625 | 337.639 |
| 0.6256944444444444 | 314.98 |
| 0.6263888888888889 | 296.808 |
| 0.6270833333333333 | 575.299 |
| 0.6277777777777778 | 634.105 |
| 0.6284722222222222 | 625.784 |
| 0.6291666666666667 | 613.252 |
| 0.6298611111111111 | 489.108 |
| 0.6305555555555555 | 310.44 |
| 0.63125 | 287.709 |
| 0.6319444444444444 | 360.221 |
| 0.6326388888888889 | 588.009 |
| 0.6333333333333333 | 571.049 |
| 0.6340277777777777 | 346.682 |
| 0.6347222222222222 | 489.108 |
| 0.6354166666666666 | 278.603 |
| 0.6361111111111112 | 287.709 |
| 0.6368055555555555 | 287.709 |
| 0.6375000000000001 | 287.709 |
| 0.6381944444444444 | 269.49 |
| 0.638888888888889 | 471.582 |
| 0.6395833333333333 | 484.735 |
| 0.6402777777777778 | 506.542 |
| 0.6409722222222222 | 418.492 |
| 0.6416666666666667 | 391.685 |
| 0.642361111111111 | 373.729 |
| 0.6430555555555556 | 523.88 |
| 0.6437499999999999 | 400.638 |
| 0.6444444444444445 | 378.224 |
| 0.6451388888888888 | 369.23 |
| 0.6458333333333334 | 333.113 |
| 0.6465277777777778 | 314.98 |
| 0.6472222222222223 | 310.44 |
| 0.6479166666666667 | 471.582 |
| 0.6486111111111111 | 497.836 |
| 0.6493055555555556 | 471.582 |
| 0.65 | 431.833 |
| 0.6506944444444445 | 305.898 |
| 0.6513888888888889 | 292.259 |
| 0.6520833333333333 | 305.898 |
| 0.6527777777777778 | 462.786 |
| 0.6534722222222222 | 462.786 |
| 0.6541666666666667 | 422.943 |
| 0.6548611111111111 | 387.202 |
| 0.6555555555555556 | 369.23 |
| 0.65625 | 346.682 |
| 0.6569444444444444 | 333.113 |
| 0.6576388888888889 | 333.113 |
| 0.6583333333333333 | 355.712 |
| 0.6590277777777778 | 269.49 |
| 0.6597222222222222 | 324.052 |
| 0.6604166666666667 | 351.198 |
| 0.6611111111111111 | 382.715 |
| 0.6618055555555555 | 342.162 |
| 0.6625 | 310.44 |
| 0.6631944444444444 | 173.709 |
| 0.6638888888888889 | 182.82 |
| 0.6645833333333333 | 201.058 |
| 0.6652777777777777 | 219.309 |
| 0.6659722222222222 | 223.873 |
| 0.6666666666666666 | 246.689 |
| 0.6673611111111111 | 274.047 |
| 0.6680555555555556 | 296.808 |
| 0.6687500000000001 | 391.685 |
| 0.6694444444444444 | 337.639 |
| 0.6701388888888888 | 378.224 |
| 0.6708333333333334 | 369.23 |
| 0.6715277777777778 | 369.23 |
| 0.6722222222222222 | 346.682 |
| 0.6729166666666666 | 324.052 |
| 0.6736111111111112 | 274.047 |
| 0.6743055555555556 | 219.309 |
| 0.6749999999999999 | 255.813 |
| 0.6756944444444444 | 246.689 |
| 0.6763888888888889 | 337.639 |
| 0.6770833333333334 | 255.813 |
| 0.6777777777777777 | 296.808 |
| 0.6784722222222223 | 269.49 |
| 0.6791666666666667 | 278.603 |
| 0.6798611111111111 | 269.49 |
| 0.6805555555555555 | 251.251 |
| 0.68125 | 292.259 |
| 0.6819444444444445 | 292.259 |
| 0.6826388888888889 | 351.198 |
| 0.6833333333333332 | 242.127 |
| 0.6840277777777778 | 292.259 |
| 0.6847222222222222 | 287.709 |
| 0.6854166666666667 | 296.808 |
| 0.686111111111111 | 301.354 |
| 0.6868055555555556 | 255.813 |
| 0.6875 | 237.564 |
| 0.6881944444444444 | 223.873 |
| 0.688888888888889 | 233 |
| 0.6895833333333333 | 246.689 |
| 0.6902777777777778 | 269.49 |
| 0.6909722222222222 | 337.639 |
| 0.6916666666666668 | 324.052 |
| 0.6923611111111111 | 314.98 |
| 0.6930555555555555 | 324.052 |
| 0.69375 | 255.813 |
| 0.6944444444444445 | 264.932 |
| 0.6951388888888889 | 305.898 |
| 0.6958333333333333 | 296.808 |
| 0.6965277777777777 | 260.373 |
| 0.6972222222222223 | 191.937 |
| 0.6979166666666666 | 182.82 |
| 0.6986111111111111 | 182.82 |
| 0.6993055555555556 | 260.373 |
| 0.7000000000000001 | 287.709 |
| 0.7006944444444444 | 274.047 |
| 0.7013888888888888 | 246.689 |
| 0.7020833333333334 | 233 |
| 0.7027777777777778 | 219.309 |
| 0.7034722222222222 | 210.182 |
| 0.7041666666666666 | 201.058 |
| 0.7048611111111112 | 191.937 |
| 0.7055555555555556 | 182.82 |
| 0.7062499999999999 | 146.423 |
| 0.7069444444444444 | 191.937 |
| 0.7076388888888889 | 201.058 |
| 0.7083333333333334 | 146.423 |
| 0.7090277777777777 | 178.264 |
| 0.7097222222222223 | 173.709 |
| 0.7104166666666667 | 178.264 |
| 0.7111111111111111 | 164.605 |
| 0.7118055555555555 | 233 |
| 0.7125 | 255.813 |
| 0.7131944444444445 | 255.813 |
| 0.7138888888888889 | 173.709 |
| 0.7145833333333332 | 155.509 |
| 0.7152777777777778 | 210.182 |
| 0.7159722222222222 | 155.509 |
| 0.7166666666666667 | 201.058 |
| 0.717361111111111 | 237.564 |
| 0.7180555555555556 | 210.182 |
| 0.71875 | 210.182 |
| 0.7194444444444444 | 201.058 |
| 0.720138888888889 | 187.378 |
| 0.7208333333333333 | 205.62 |
| 0.7215277777777778 | 237.564 |
| 0.7222222222222222 | 233 |
| 0.7229166666666668 | 228.436 |
| 0.7236111111111111 | 228.436 |
| 0.7243055555555555 | 223.873 |
| 0.725 | 210.182 |
| 0.7256944444444445 | 191.937 |
| 0.7263888888888889 | 178.264 |
| 0.7270833333333333 | 169.156 |
| 0.7277777777777777 | 164.605 |
| 0.7284722222222223 | 160.056 |
| 0.7291666666666666 | 155.509 |
| 0.7298611111111111 | 155.509 |
| 0.7305555555555556 | 150.964 |
| 0.7312500000000001 | 146.423 |
| 0.7319444444444444 | 141.884 |
| 0.7326388888888888 | 141.884 |
| 0.7333333333333334 | 141.884 |
| 0.7340277777777778 | 141.884 |
| 0.7347222222222222 | 137.347 |
| 0.7354166666666666 | 128.284 |
| 0.7361111111111112 | 132.814 |
| 0.7368055555555556 | 137.347 |
| 0.7374999999999999 | 137.347 |
| 0.7381944444444444 | 137.347 |
| 0.7388888888888889 | 128.284 |
| 0.7395833333333334 | 128.284 |
| 0.7402777777777777 | 128.284 |
| 0.7409722222222223 | 137.347 |
| 0.7416666666666667 | 137.347 |
| 0.7423611111111111 | 146.423 |
| 0.7430555555555555 | 141.884 |
| 0.74375 | 141.884 |
| 0.7444444444444445 | 137.347 |
| 0.7451388888888889 | 137.347 |
| 0.7458333333333332 | 128.284 |
| 0.7465277777777778 | 141.884 |
| 0.7472222222222222 | 146.423 |
| 0.7479166666666667 | 141.884 |
| 0.748611111111111 | 137.347 |
| 0.7493055555555556 | 160.056 |
| 0.75 | 123.758 |
| 0.7506944444444444 | 128.284 |
| 0.751388888888889 | 137.347 |
| 0.7520833333333333 | 137.347 |
| 0.7527777777777778 | 155.509 |
| 0.7534722222222222 | 191.937 |
| 0.7541666666666668 | 205.62 |
| 0.7548611111111111 | 187.378 |
| 0.7555555555555555 | 169.156 |
| 0.75625 | 169.156 |
| 0.7569444444444445 | 150.964 |
| 0.7576388888888889 | 128.284 |
| 0.7583333333333333 | 119.235 |
| 0.7590277777777777 | 114.716 |
| 0.7597222222222223 | 114.716 |
| 0.7604166666666666 | 150.964 |
| 0.7611111111111111 | 160.056 |
| 0.7618055555555556 | 169.156 |
| 0.7625000000000001 | 173.709 |
| 0.7631944444444444 | 164.605 |
| 0.7638888888888888 | 146.423 |
| 0.7645833333333334 | 101.184 |
| 0.7652777777777778 | 110.201 |
| 0.7659722222222222 | 105.69 |
| 0.7666666666666666 | 105.69 |
| 0.7673611111111112 | 101.184 |
| 0.7680555555555556 | 101.184 |
| 0.7687499999999999 | 101.184 |
| 0.7694444444444444 | 96.682 |
| 0.7701388888888889 | 96.682 |
| 0.7708333333333334 | 96.682 |
| 0.7715277777777777 | 96.682 |
| 0.7722222222222223 | 92.184 |
| 0.7729166666666667 | 92.184 |
| 0.7736111111111111 | 83.205 |
| 0.7743055555555555 | 83.205 |
| 0.775 | 69.775 |
| 0.7756944444444445 | 92.184 |
| 0.7763888888888889 | 83.205 |
| 0.7770833333333332 | 65.31 |
| 0.7777777777777778 | 78.722 |
| 0.7784722222222222 | 78.722 |
| 0.7791666666666667 | 74.246 |
| 0.779861111111111 | 69.775 |
| 0.7805555555555556 | 65.31 |
| 0.78125 | 56.398 |
| 0.7819444444444444 | 56.398 |
| 0.782638888888889 | 51.951 |
| 0.7833333333333333 | 51.951 |
| 0.7840277777777778 | 51.951 |
| 0.7847222222222222 | 51.951 |
| 0.7854166666666668 | 51.951 |
| 0.7861111111111111 | 56.398 |
| 0.7868055555555555 | 51.951 |
| 0.7875 | 51.951 |
| 0.7881944444444445 | 51.951 |
| 0.7888888888888889 | 56.398 |
| 0.7895833333333333 | 51.951 |
| 0.7902777777777777 | 47.511 |
| 0.7909722222222223 | 51.951 |
| 0.7916666666666666 | 51.951 |
| 0.7923611111111111 | 51.951 |
| 0.7930555555555556 | 51.951 |
| 0.7937500000000001 | 51.951 |
| 0.7944444444444444 | 47.511 |
| 0.7951388888888888 | 47.511 |
| 0.7958333333333334 | 51.951 |
| 0.7965277777777778 | 56.398 |
| 0.7972222222222222 | 51.951 |
| 0.7979166666666666 | 47.511 |
| 0.7986111111111112 | 47.511 |
| 0.7993055555555556 | 47.511 |
| 0.7999999999999999 | 47.511 |
| 0.8006944444444444 | 47.511 |
| 0.8013888888888889 | 47.511 |
| 0.8020833333333334 | 47.511 |
| 0.8027777777777777 | 47.511 |
| 0.8034722222222223 | 47.511 |
| 0.8041666666666667 | 43.079 |
| 0.8048611111111111 | 43.079 |
| 0.8055555555555555 | 43.079 |
| 0.80625 | 43.079 |
| 0.8069444444444445 | 38.653 |
| 0.8076388888888889 | 38.653 |
| 0.8083333333333332 | 38.653 |
| 0.8090277777777778 | 38.653 |
| 0.8097222222222222 | 34.234 |
| 0.8104166666666667 | 34.234 |
| 0.811111111111111 | 38.653 |
| 0.8118055555555556 | 38.653 |
| 0.8125 | 38.653 |
| 0.8131944444444444 | 38.653 |
| 0.813888888888889 | 38.653 |
| 0.8145833333333333 | 38.653 |
| 0.8152777777777778 | 34.234 |
| 0.8159722222222222 | 29.823 |
| 0.8166666666666668 | 29.823 |
| 0.8173611111111111 | 29.823 |
| 0.8180555555555555 | 29.823 |
| 0.81875 | 29.823 |
| 0.8194444444444445 | 29.823 |
| 0.8201388888888889 | 29.823 |
| 0.8208333333333333 | 29.823 |
| 0.8215277777777777 | 25.419 |
| 0.8222222222222223 | 25.419 |
| 0.8229166666666666 | 25.419 |
| 0.8236111111111111 | 29.823 |
| 0.8243055555555556 | 29.823 |
| 0.8250000000000001 | 29.823 |
| 0.8256944444444444 | 29.823 |
| 0.8263888888888888 | 29.823 |
| 0.8270833333333334 | 29.823 |
| 0.8277777777777778 | 29.823 |
| 0.8284722222222222 | 29.823 |
| 0.8291666666666666 | 29.823 |
| 0.8298611111111112 | 29.823 |
| 0.8305555555555556 | 29.823 |
| 0.8312499999999999 | 29.823 |
| 0.8319444444444444 | 25.419 |
| 0.8326388888888889 | 25.419 |
| 0.8333333333333334 | 25.419 |
| 0.8340277777777777 | 25.419 |
| 0.8347222222222223 | 21.024 |
| 0.8354166666666667 | 21.024 |
| 0.8361111111111111 | 21.024 |
| 0.8368055555555555 | 21.024 |
| 0.8375 | 16.636 |
| 0.8381944444444445 | 16.636 |
| 0.8388888888888889 | 12.257 |
| 0.8395833333333332 | 12.257 |
| 0.8402777777777778 | 12.257 |
| 0.8409722222222222 | 12.257 |
| 0.8416666666666667 | 12.257 |
| 0.842361111111111 | 7.887 |
| 0.8430555555555556 | 7.887 |
| 0.84375 | 7.887 |
| 0.8444444444444444 | 3.525 |
| 0.845138888888889 | 3.525 |
| 0.8458333333333333 | 3.525 |
| 0.8465277777777778 | 3.525 |
| 0.8472222222222222 | 3.525 |
| 0.8479166666666668 | 3.525 |
| 0.8486111111111111 | 3.525 |
| 0.8493055555555555 | 0 |
| 0.85 | 0 |
| 0.8506944444444445 | 0 |
| 0.8513888888888889 | 0 |
| 0.8520833333333333 | 0 |
| 0.8527777777777777 | 0 |
| 0.8534722222222223 | 0 |
| 0.8541666666666666 | 0 |
| 0.8548611111111111 | 0 |
| 0.8555555555555556 | 0 |
| 0.8562500000000001 | 0 |
| 0.8569444444444444 | 0 |
| 0.8576388888888888 | 0 |
| 0.8583333333333334 | 0 |
| 0.8590277777777778 | 0 |
| 0.8597222222222222 | 0 |
| 0.8604166666666666 | 0 |
| 0.8611111111111112 | 0 |
| 0.8618055555555556 | 0 |
| 0.8624999999999999 | 0 |
| 0.8631944444444444 | 0 |
| 0.8638888888888889 | 0 |
| 0.8645833333333334 | 0 |
| 0.8652777777777777 | 0 |
| 0.8659722222222223 | 0 |
| 0.8666666666666667 | 0 |
| 0.8673611111111111 | 0 |
| 0.8680555555555555 | 0 |
| 0.86875 | 0 |
| 0.8694444444444445 | 0 |
| 0.8701388888888889 | 0 |
| 0.8708333333333332 | 0 |
| 0.8715277777777778 | 0 |
| 0.8722222222222222 | 0 |
| 0.8729166666666667 | 0 |
| 0.873611111111111 | 0 |
| 0.8743055555555556 | 0 |
| 0.875 | 0 |
| 0.8756944444444444 | 0 |
| 0.876388888888889 | 0 |
| 0.8770833333333333 | 0 |
| 0.8777777777777778 | 0 |
| 0.8784722222222222 | 0 |
| 0.8791666666666668 | 0 |
| 0.8798611111111111 | 0 |
| 0.8805555555555555 | 0 |
| 0.88125 | 0 |
| 0.8819444444444445 | 0 |
| 0.8826388888888889 | 0 |
| 0.8833333333333333 | 0 |
| 0.8840277777777777 | 0 |
| 0.8847222222222223 | 0 |
| 0.8854166666666666 | 0 |
| 0.8861111111111111 | 0 |
| 0.8868055555555556 | 0 |
| 0.8875000000000001 | 0 |
| 0.8881944444444444 | 0 |
| 0.8888888888888888 | 0 |
| 0.8895833333333334 | 0 |
| 0.8902777777777778 | 0 |
| 0.8909722222222222 | 0 |
| 0.8916666666666666 | 0 |
| 0.8923611111111112 | 0 |
| 0.8930555555555556 | 0 |
| 0.8937499999999999 | 0 |
| 0.8944444444444444 | 0 |
| 0.8951388888888889 | 0 |
| 0.8958333333333334 | 0 |
| 0.8965277777777777 | 0 |
| 0.8972222222222223 | 0 |
| 0.8979166666666667 | 0 |
| 0.8986111111111111 | 0 |
| 0.8993055555555555 | 0 |
| 0.9 | 0 |
| 0.9006944444444445 | 0 |
| 0.9013888888888889 | 0 |
| 0.9020833333333332 | 0 |
| 0.9027777777777778 | 0 |
| 0.9034722222222222 | 0 |
| 0.9041666666666667 | 0 |
| 0.904861111111111 | 0 |
| 0.9055555555555556 | 0 |
| 0.90625 | 0 |
| 0.9069444444444444 | 0 |
| 0.907638888888889 | 0 |
| 0.9083333333333333 | 0 |
| 0.9090277777777778 | 0 |
| 0.9097222222222222 | 0 |
| 0.9104166666666668 | 0 |
| 0.9111111111111111 | 0 |
| 0.9118055555555555 | 0 |
| 0.9125 | 0 |
| 0.9131944444444445 | 0 |
| 0.9138888888888889 | 0 |
| 0.9145833333333333 | 0 |
| 0.9152777777777777 | 0 |
| 0.9159722222222223 | 0 |
| 0.9166666666666666 | 0 |
| 0.9173611111111111 | 0 |
| 0.9180555555555556 | 0 |
| 0.9187500000000001 | 0 |
| 0.9194444444444444 | 0 |
| 0.9201388888888888 | 0 |
| 0.9208333333333334 | 0 |
| 0.9215277777777778 | 0 |
| 0.9222222222222222 | 0 |
| 0.9229166666666666 | 0 |
| 0.9236111111111112 | 0 |
| 0.9243055555555556 | 0 |
| 0.9249999999999999 | 0 |
| 0.9256944444444444 | 0 |
| 0.9263888888888889 | 0 |
| 0.9270833333333334 | 0 |
| 0.9277777777777777 | 0 |
| 0.9284722222222223 | 0 |
| 0.9291666666666667 | 0 |
| 0.9298611111111111 | 0 |
| 0.9305555555555555 | 0 |
| 0.93125 | 0 |
| 0.9319444444444445 | 0 |
| 0.9326388888888889 | 0 |
| 0.9333333333333332 | 0 |
| 0.9340277777777778 | 0 |
| 0.9347222222222222 | 0 |
| 0.9354166666666667 | 0 |
| 0.936111111111111 | 0 |
| 0.9368055555555556 | 0 |
| 0.9375 | 0 |
| 0.9381944444444444 | 0 |
| 0.938888888888889 | 0 |
| 0.9395833333333333 | 0 |
| 0.9402777777777778 | 0 |
| 0.9409722222222222 | 0 |
| 0.9416666666666668 | 0 |
| 0.9423611111111111 | 0 |
| 0.9430555555555555 | 0 |
| 0.94375 | 0 |
| 0.9444444444444445 | 0 |
| 0.9451388888888889 | 0 |
| 0.9458333333333333 | 0 |
| 0.9465277777777777 | 0 |
| 0.9472222222222223 | 0 |
| 0.9479166666666666 | 0 |
| 0.9486111111111111 | 0 |
| 0.9493055555555556 | 0 |
| 0.9500000000000001 | 0 |
| 0.9506944444444444 | 0 |
| 0.9513888888888888 | 0 |
| 0.9520833333333334 | 0 |
| 0.9527777777777778 | 0 |
| 0.9534722222222222 | 0 |
| 0.9541666666666666 | 0 |
| 0.9548611111111112 | 0 |
| 0.9555555555555556 | 0 |
| 0.9562499999999999 | 0 |
| 0.9569444444444444 | 0 |
| 0.9576388888888889 | 0 |
| 0.9583333333333334 | 0 |
| 0.9590277777777777 | 0 |
| 0.9597222222222223 | 0 |
| 0.9604166666666667 | 0 |
| 0.9611111111111111 | 0 |
| 0.9618055555555555 | 0 |
| 0.9625 | 0 |
| 0.9631944444444445 | 0 |
| 0.9638888888888889 | 0 |
| 0.9645833333333332 | 0 |
| 0.9652777777777778 | 0 |
| 0.9659722222222222 | 0 |
| 0.9666666666666667 | 0 |
| 0.967361111111111 | 0 |
| 0.9680555555555556 | 0 |
| 0.96875 | 0 |
| 0.9694444444444444 | 0 |
| 0.970138888888889 | 0 |
| 0.9708333333333333 | 0 |
| 0.9715277777777778 | 0 |
| 0.9722222222222222 | 0 |
| 0.9729166666666668 | 0 |
| 0.9736111111111111 | 0 |
| 0.9743055555555555 | 0 |
| 0.975 | 0 |
| 0.9756944444444445 | 0 |
| 0.9763888888888889 | 0 |
| 0.9770833333333333 | 0 |
| 0.9777777777777777 | 0 |
| 0.9784722222222223 | 0 |
| 0.9791666666666666 | 0 |
| 0.9798611111111111 | 0 |
| 0.9805555555555556 | 0 |
| 0.9812500000000001 | 0 |
| 0.9819444444444444 | 0 |
| 0.9826388888888888 | 0 |
| 0.9833333333333334 | 0 |
| 0.9840277777777778 | 0 |
| 0.9847222222222222 | 0 |
| 0.9854166666666666 | 0 |
| 0.9861111111111112 | 0 |
| 0.9868055555555556 | 0 |
| 0.9874999999999999 | 0 |
| 0.9881944444444444 | 0 |
| 0.9888888888888889 | 0 |
| 0.9895833333333334 | 0 |
| 0.9902777777777777 | 0 |
| 0.9909722222222223 | 0 |
| 0.9916666666666667 | 0 |
| 0.9923611111111111 | 0 |
| 0.9930555555555555 | 0 |
| 0.99375 | 0 |
| 0.9944444444444445 | 0 |
| 0.9951388888888889 | 0 |
| 0.9958333333333332 | 0 |
| 0.9965277777777778 | 0 |
| 0.9972222222222222 | 0 |
| 0.9979166666666667 | 0 |
| 0.998611111111111 | 0 |
| 0.9993055555555556 | 0 |